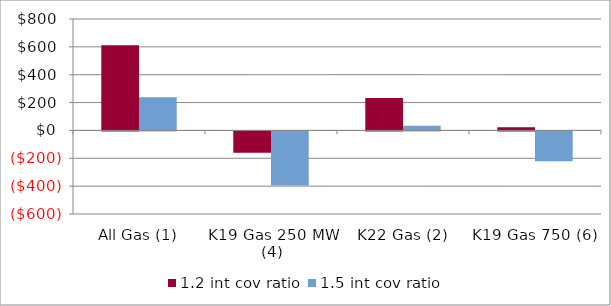
| Category | 1.2 int cov ratio | 1.5 int cov ratio |
|---|---|---|
| All Gas (1) | 612.004 | 237.433 |
| K19 Gas 250 MW (4) | -153.109 | -387.394 |
| K22 Gas (2) | 232.651 | 33.418 |
| K19 Gas 750 (6) | 22.683 | -214.407 |